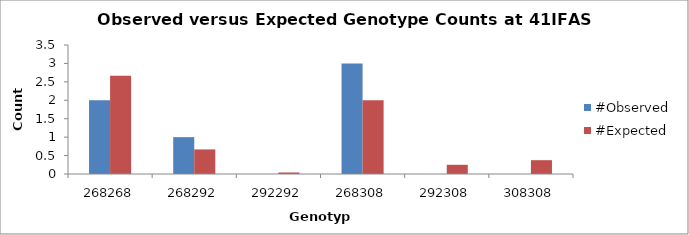
| Category | #Observed | #Expected |
|---|---|---|
| 268268.0 | 2 | 2.667 |
| 268292.0 | 1 | 0.667 |
| 292292.0 | 0 | 0.042 |
| 268308.0 | 3 | 2 |
| 292308.0 | 0 | 0.25 |
| 308308.0 | 0 | 0.375 |